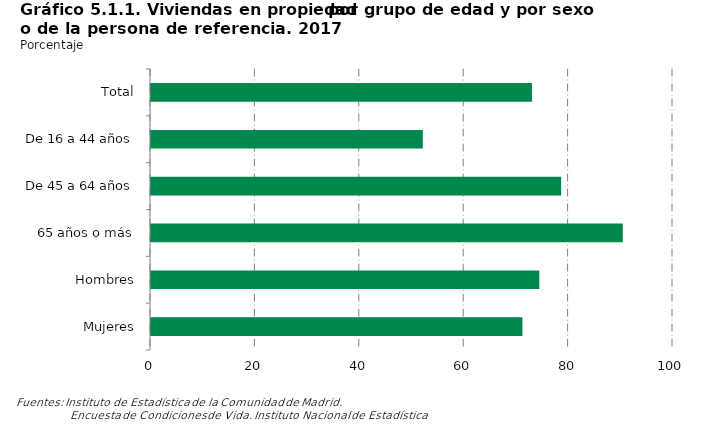
| Category | Series 0 |
|---|---|
|    Total | 72.995 |
|    De 16 a 44 años | 52.07 |
|    De 45 a 64 años | 78.575 |
|    65 años o más | 90.377 |
| Hombres | 74.393 |
| Mujeres | 71.149 |